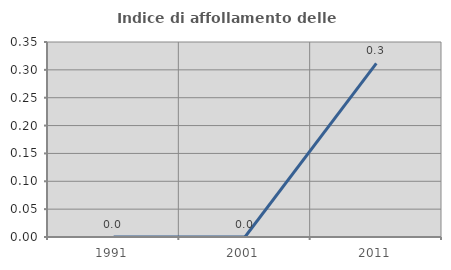
| Category | Indice di affollamento delle abitazioni  |
|---|---|
| 1991.0 | 0 |
| 2001.0 | 0 |
| 2011.0 | 0.312 |